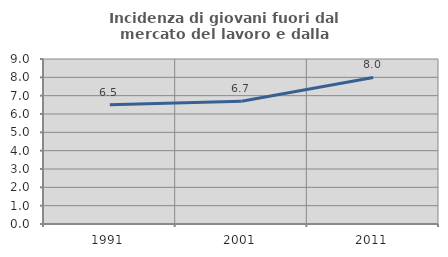
| Category | Incidenza di giovani fuori dal mercato del lavoro e dalla formazione  |
|---|---|
| 1991.0 | 6.503 |
| 2001.0 | 6.696 |
| 2011.0 | 7.994 |